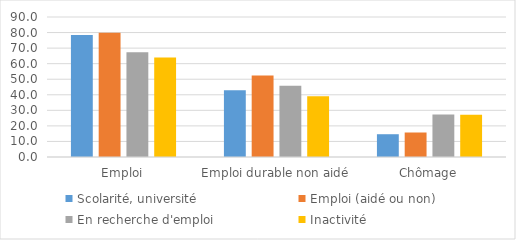
| Category | Scolarité, université | Emploi (aidé ou non) | En recherche d'emploi | Inactivité |
|---|---|---|---|---|
| Emploi | 78.391 | 79.929 | 67.301 | 64.032 |
| Emploi durable non aidé | 42.887 | 52.428 | 45.809 | 38.996 |
| Chômage | 14.645 | 15.752 | 27.366 | 27.158 |